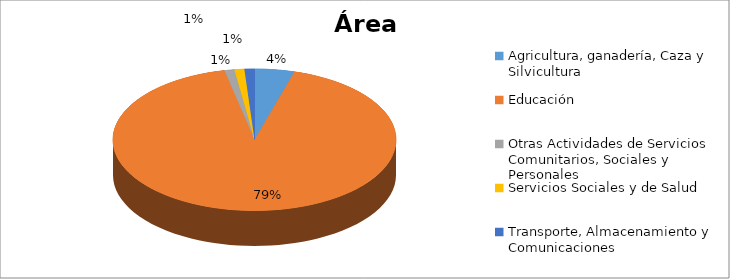
| Category | Series 0 |
|---|---|
| Agricultura, ganadería, Caza y Silvicultura | 0.039 |
| Educación | 0.794 |
| Otras Actividades de Servicios Comunitarios, Sociales y Personales | 0.01 |
| Servicios Sociales y de Salud | 0.01 |
| Transporte, Almacenamiento y Comunicaciones | 0.01 |